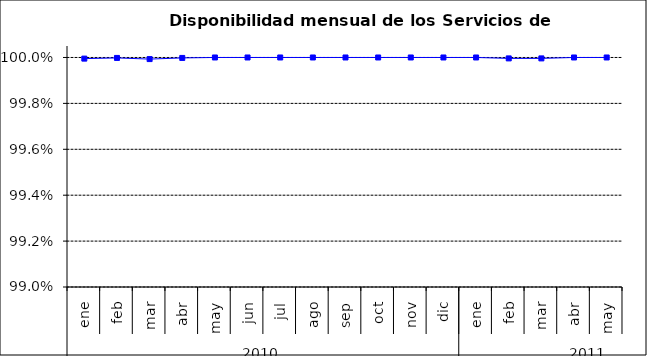
| Category | SCL * |
|---|---|
| 0 | 1 |
| 1 | 1 |
| 2 | 1 |
| 3 | 1 |
| 4 | 1 |
| 5 | 1 |
| 6 | 1 |
| 7 | 1 |
| 8 | 1 |
| 9 | 1 |
| 10 | 1 |
| 11 | 1 |
| 12 | 1 |
| 13 | 1 |
| 14 | 1 |
| 15 | 1 |
| 16 | 1 |